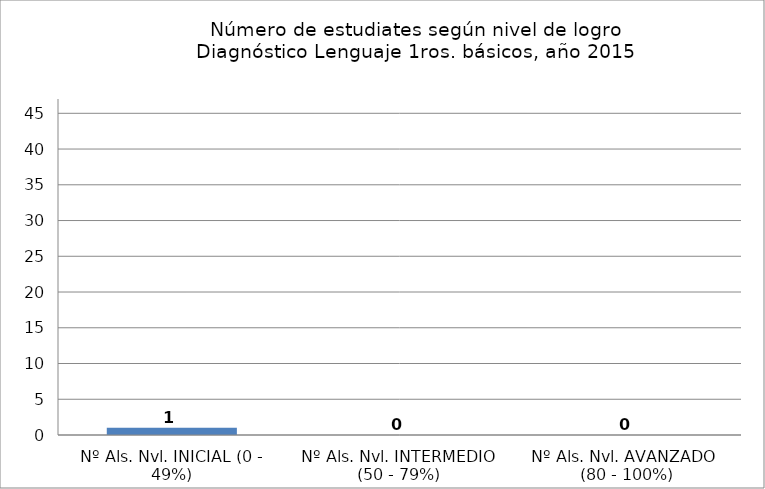
| Category | Series 0 |
|---|---|
| Nº Als. Nvl. INICIAL (0 - 49%) | 1 |
| Nº Als. Nvl. INTERMEDIO (50 - 79%) | 0 |
| Nº Als. Nvl. AVANZADO  (80 - 100%) | 0 |